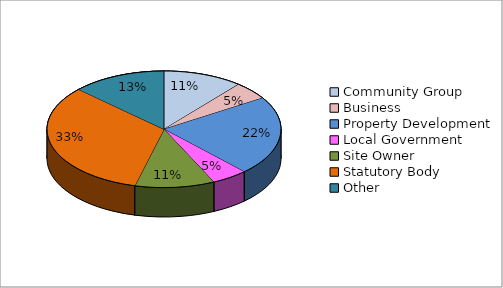
| Category | Total % |
|---|---|
| Community Group | 0.11 |
| Business | 0.05 |
| Property Development | 0.22 |
| Local Government | 0.05 |
| Site Owner | 0.11 |
| Statutory Body | 0.33 |
| Other | 0.13 |